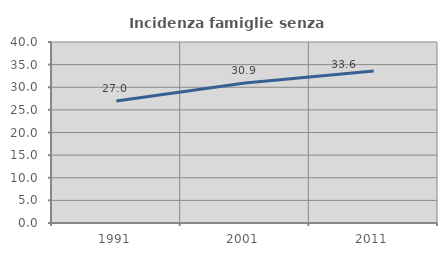
| Category | Incidenza famiglie senza nuclei |
|---|---|
| 1991.0 | 26.955 |
| 2001.0 | 30.945 |
| 2011.0 | 33.585 |